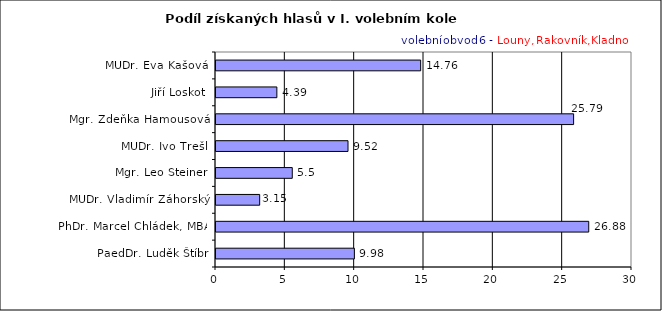
| Category | Series 0 |
|---|---|
| PaedDr. Luděk Štíbr | 9.98 |
| PhDr. Marcel Chládek, MBA | 26.88 |
| MUDr. Vladimír Záhorský | 3.15 |
| Mgr. Leo Steiner | 5.5 |
| MUDr. Ivo Trešl | 9.52 |
| Mgr. Zdeňka Hamousová | 25.79 |
| Jiří Loskot | 4.39 |
| MUDr. Eva Kašová | 14.76 |